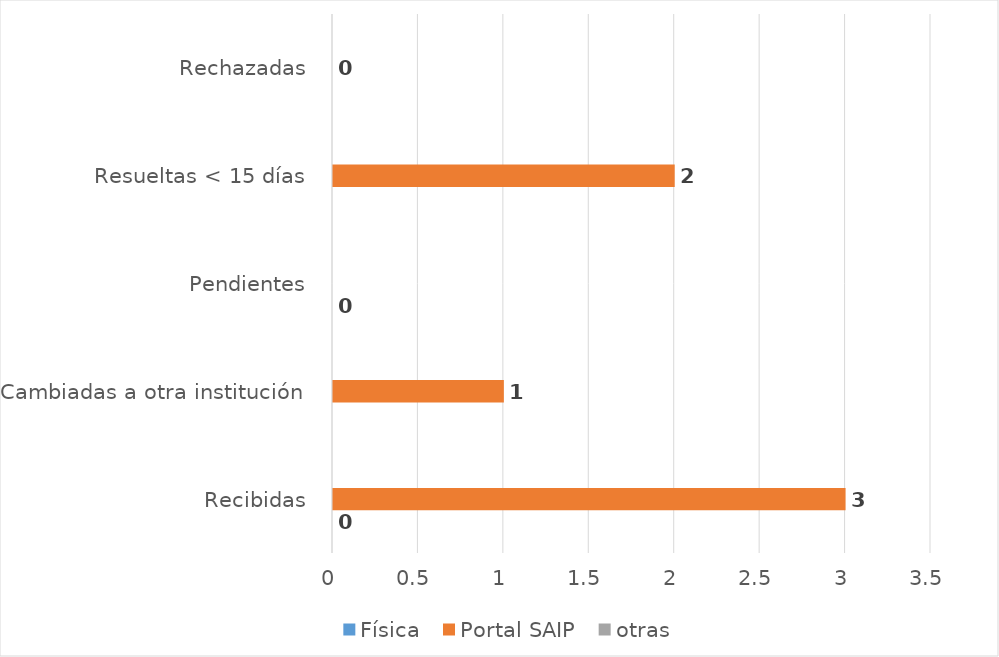
| Category | Física | Portal SAIP | otras |
|---|---|---|---|
| Recibidas | 0 | 3 | 0 |
| Cambiadas a otra institución | 0 | 1 | 0 |
| Pendientes | 0 | 0 | 0 |
| Resueltas < 15 días | 0 | 2 | 0 |
| Rechazadas | 0 | 0 | 0 |